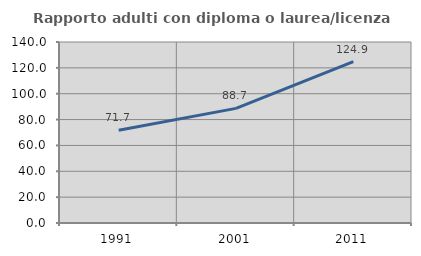
| Category | Rapporto adulti con diploma o laurea/licenza media  |
|---|---|
| 1991.0 | 71.728 |
| 2001.0 | 88.651 |
| 2011.0 | 124.895 |